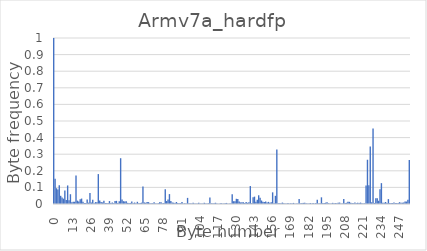
| Category | Series 0 |
|---|---|
| 0.0 | 1 |
| 1.0 | 0.152 |
| 2.0 | 0.095 |
| 3.0 | 0.087 |
| 4.0 | 0.114 |
| 5.0 | 0.049 |
| 6.0 | 0.039 |
| 7.0 | 0.032 |
| 8.0 | 0.081 |
| 9.0 | 0.024 |
| 10.0 | 0.112 |
| 11.0 | 0.022 |
| 12.0 | 0.059 |
| 13.0 | 0.01 |
| 14.0 | 0.014 |
| 15.0 | 0.014 |
| 16.0 | 0.172 |
| 17.0 | 0.02 |
| 18.0 | 0.015 |
| 19.0 | 0.028 |
| 20.0 | 0.033 |
| 21.0 | 0.013 |
| 22.0 | 0.006 |
| 23.0 | 0.006 |
| 24.0 | 0.027 |
| 25.0 | 0.008 |
| 26.0 | 0.066 |
| 27.0 | 0.009 |
| 28.0 | 0.025 |
| 29.0 | 0.005 |
| 30.0 | 0.011 |
| 31.0 | 0.01 |
| 32.0 | 0.18 |
| 33.0 | 0.021 |
| 34.0 | 0.013 |
| 35.0 | 0.01 |
| 36.0 | 0.02 |
| 37.0 | 0.006 |
| 38.0 | 0.005 |
| 39.0 | 0.006 |
| 40.0 | 0.018 |
| 41.0 | 0.006 |
| 42.0 | 0.009 |
| 43.0 | 0.005 |
| 44.0 | 0.018 |
| 45.0 | 0.019 |
| 46.0 | 0.006 |
| 47.0 | 0.017 |
| 48.0 | 0.276 |
| 49.0 | 0.028 |
| 50.0 | 0.017 |
| 51.0 | 0.016 |
| 52.0 | 0.016 |
| 53.0 | 0.007 |
| 54.0 | 0.006 |
| 55.0 | 0.006 |
| 56.0 | 0.014 |
| 57.0 | 0.004 |
| 58.0 | 0.009 |
| 59.0 | 0.005 |
| 60.0 | 0.013 |
| 61.0 | 0.004 |
| 62.0 | 0.006 |
| 63.0 | 0.008 |
| 64.0 | 0.106 |
| 65.0 | 0.009 |
| 66.0 | 0.008 |
| 67.0 | 0.012 |
| 68.0 | 0.011 |
| 69.0 | 0.005 |
| 70.0 | 0.004 |
| 71.0 | 0.005 |
| 72.0 | 0.011 |
| 73.0 | 0.003 |
| 74.0 | 0.003 |
| 75.0 | 0.004 |
| 76.0 | 0.011 |
| 77.0 | 0.01 |
| 78.0 | 0.004 |
| 79.0 | 0.006 |
| 80.0 | 0.089 |
| 81.0 | 0.018 |
| 82.0 | 0.027 |
| 83.0 | 0.06 |
| 84.0 | 0.017 |
| 85.0 | 0.01 |
| 86.0 | 0.008 |
| 87.0 | 0.007 |
| 88.0 | 0.012 |
| 89.0 | 0.006 |
| 90.0 | 0.005 |
| 91.0 | 0.005 |
| 92.0 | 0.013 |
| 93.0 | 0.002 |
| 94.0 | 0.005 |
| 95.0 | 0.003 |
| 96.0 | 0.037 |
| 97.0 | 0.005 |
| 98.0 | 0.003 |
| 99.0 | 0.004 |
| 100.0 | 0.008 |
| 101.0 | 0.003 |
| 102.0 | 0.003 |
| 103.0 | 0.003 |
| 104.0 | 0.007 |
| 105.0 | 0.002 |
| 106.0 | 0.003 |
| 107.0 | 0.003 |
| 108.0 | 0.007 |
| 109.0 | 0.002 |
| 110.0 | 0.002 |
| 111.0 | 0.005 |
| 112.0 | 0.04 |
| 113.0 | 0.004 |
| 114.0 | 0.004 |
| 115.0 | 0.004 |
| 116.0 | 0.007 |
| 117.0 | 0.002 |
| 118.0 | 0.002 |
| 119.0 | 0.002 |
| 120.0 | 0.007 |
| 121.0 | 0.002 |
| 122.0 | 0.003 |
| 123.0 | 0.004 |
| 124.0 | 0.006 |
| 125.0 | 0.002 |
| 126.0 | 0.003 |
| 127.0 | 0.003 |
| 128.0 | 0.058 |
| 129.0 | 0.017 |
| 130.0 | 0.017 |
| 131.0 | 0.031 |
| 132.0 | 0.03 |
| 133.0 | 0.014 |
| 134.0 | 0.01 |
| 135.0 | 0.01 |
| 136.0 | 0.011 |
| 137.0 | 0.005 |
| 138.0 | 0.012 |
| 139.0 | 0.007 |
| 140.0 | 0.011 |
| 141.0 | 0.108 |
| 142.0 | 0.005 |
| 143.0 | 0.041 |
| 144.0 | 0.044 |
| 145.0 | 0.014 |
| 146.0 | 0.026 |
| 147.0 | 0.053 |
| 148.0 | 0.037 |
| 149.0 | 0.021 |
| 150.0 | 0.014 |
| 151.0 | 0.012 |
| 152.0 | 0.015 |
| 153.0 | 0.008 |
| 154.0 | 0.013 |
| 155.0 | 0.007 |
| 156.0 | 0.01 |
| 157.0 | 0.07 |
| 158.0 | 0.005 |
| 159.0 | 0.049 |
| 160.0 | 0.328 |
| 161.0 | 0.004 |
| 162.0 | 0.004 |
| 163.0 | 0.005 |
| 164.0 | 0.008 |
| 165.0 | 0.004 |
| 166.0 | 0.003 |
| 167.0 | 0.003 |
| 168.0 | 0.006 |
| 169.0 | 0.002 |
| 170.0 | 0.004 |
| 171.0 | 0.002 |
| 172.0 | 0.007 |
| 173.0 | 0.002 |
| 174.0 | 0.003 |
| 175.0 | 0.002 |
| 176.0 | 0.03 |
| 177.0 | 0.004 |
| 178.0 | 0.005 |
| 179.0 | 0.007 |
| 180.0 | 0.008 |
| 181.0 | 0.004 |
| 182.0 | 0.003 |
| 183.0 | 0.002 |
| 184.0 | 0.006 |
| 185.0 | 0.002 |
| 186.0 | 0.006 |
| 187.0 | 0.002 |
| 188.0 | 0.007 |
| 189.0 | 0.026 |
| 190.0 | 0.003 |
| 191.0 | 0.004 |
| 192.0 | 0.04 |
| 193.0 | 0.006 |
| 194.0 | 0.006 |
| 195.0 | 0.008 |
| 196.0 | 0.011 |
| 197.0 | 0.005 |
| 198.0 | 0.004 |
| 199.0 | 0.003 |
| 200.0 | 0.007 |
| 201.0 | 0.005 |
| 202.0 | 0.006 |
| 203.0 | 0.004 |
| 204.0 | 0.007 |
| 205.0 | 0.009 |
| 206.0 | 0.004 |
| 207.0 | 0.003 |
| 208.0 | 0.03 |
| 209.0 | 0.006 |
| 210.0 | 0.007 |
| 211.0 | 0.014 |
| 212.0 | 0.013 |
| 213.0 | 0.007 |
| 214.0 | 0.005 |
| 215.0 | 0.005 |
| 216.0 | 0.009 |
| 217.0 | 0.005 |
| 218.0 | 0.008 |
| 219.0 | 0.005 |
| 220.0 | 0.008 |
| 221.0 | 0.004 |
| 222.0 | 0.004 |
| 223.0 | 0.004 |
| 224.0 | 0.112 |
| 225.0 | 0.267 |
| 226.0 | 0.114 |
| 227.0 | 0.347 |
| 228.0 | 0.01 |
| 229.0 | 0.455 |
| 230.0 | 0.006 |
| 231.0 | 0.035 |
| 232.0 | 0.035 |
| 233.0 | 0.02 |
| 234.0 | 0.089 |
| 235.0 | 0.126 |
| 236.0 | 0.008 |
| 237.0 | 0.007 |
| 238.0 | 0.012 |
| 239.0 | 0.006 |
| 240.0 | 0.03 |
| 241.0 | 0.006 |
| 242.0 | 0.005 |
| 243.0 | 0.006 |
| 244.0 | 0.008 |
| 245.0 | 0.006 |
| 246.0 | 0.005 |
| 247.0 | 0.006 |
| 248.0 | 0.011 |
| 249.0 | 0.008 |
| 250.0 | 0.008 |
| 251.0 | 0.01 |
| 252.0 | 0.015 |
| 253.0 | 0.015 |
| 254.0 | 0.026 |
| 255.0 | 0.265 |